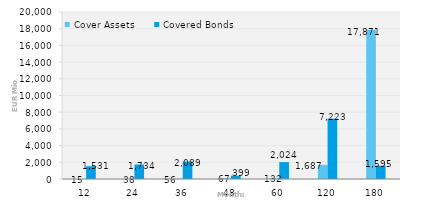
| Category | Cover Assets | Covered Bonds |
|---|---|---|
| 12.0 | 15.012 | 1531.286 |
| 24.0 | 37.862 | 1733.5 |
| 36.0 | 56.03 | 2089 |
| 48.0 | 67.226 | 398.5 |
| 60.0 | 131.723 | 2023.98 |
| 120.0 | 1686.855 | 7222.536 |
| 180.0 | 17871.291 | 1594.756 |